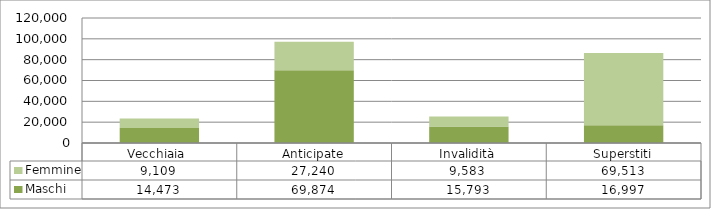
| Category | Maschi | Femmine |
|---|---|---|
| Vecchiaia  | 14473 | 9109 |
| Anticipate | 69874 | 27240 |
| Invalidità | 15793 | 9583 |
| Superstiti | 16997 | 69513 |